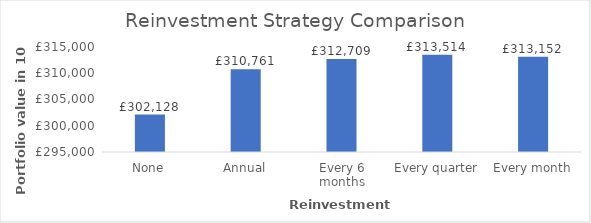
| Category | Series 0 |
|---|---|
| None | 302128.25 |
| Annual | 310760.911 |
| Every 6 months | 312708.797 |
| Every quarter | 313514.199 |
| Every month | 313152.015 |